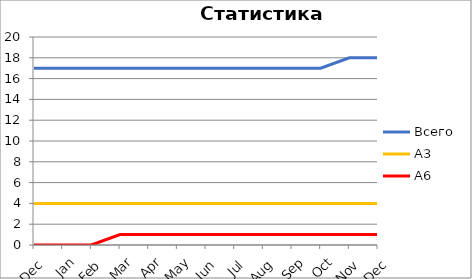
| Category | Всего | А3 | A6 |
|---|---|---|---|
| 0 | 17 | 4 | 0 |
| 1 | 17 | 4 | 0 |
| 2 | 17 | 4 | 0 |
| 3 | 17 | 4 | 1 |
| 4 | 17 | 4 | 1 |
| 5 | 17 | 4 | 1 |
| 6 | 17 | 4 | 1 |
| 7 | 17 | 4 | 1 |
| 8 | 17 | 4 | 1 |
| 9 | 17 | 4 | 1 |
| 10 | 17 | 4 | 1 |
| 11 | 18 | 4 | 1 |
| 12 | 18 | 4 | 1 |